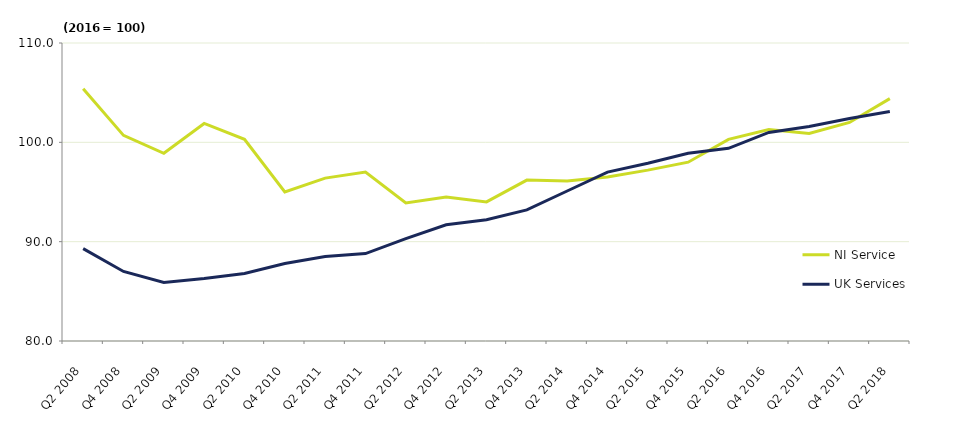
| Category | NI Service | UK Services |
|---|---|---|
| Q2 2008 | 105.4 | 89.3 |
| Q4 2008 | 100.7 | 87 |
| Q2 2009 | 98.9 | 85.9 |
| Q4 2009 | 101.9 | 86.3 |
| Q2 2010 | 100.3 | 86.8 |
| Q4 2010 | 95 | 87.8 |
| Q2 2011 | 96.4 | 88.5 |
| Q4 2011 | 97 | 88.8 |
| Q2 2012 | 93.9 | 90.3 |
| Q4 2012 | 94.5 | 91.7 |
| Q2 2013 | 94 | 92.2 |
| Q4 2013 | 96.2 | 93.2 |
| Q2 2014 | 96.1 | 95.1 |
| Q4 2014 | 96.5 | 97 |
| Q2 2015 | 97.2 | 97.9 |
| Q4 2015 | 98 | 98.9 |
| Q2 2016 | 100.3 | 99.4 |
| Q4 2016 | 101.3 | 101 |
| Q2 2017 | 100.9 | 101.6 |
| Q4 2017 | 102 | 102.4 |
| Q2 2018 | 104.4 | 103.1 |